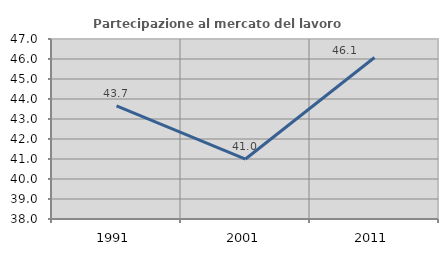
| Category | Partecipazione al mercato del lavoro  femminile |
|---|---|
| 1991.0 | 43.653 |
| 2001.0 | 40.998 |
| 2011.0 | 46.075 |